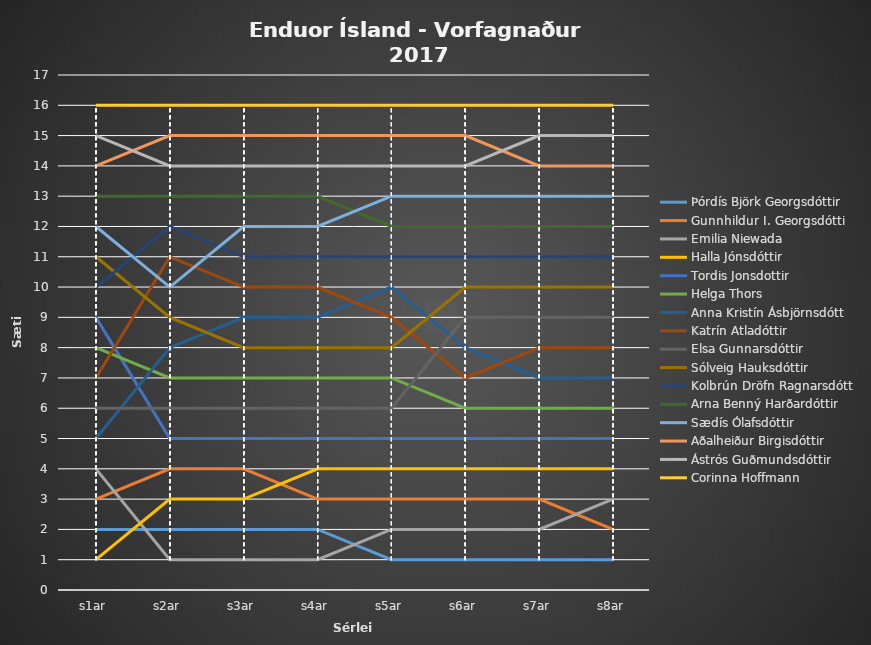
| Category | Þórdís Björk Georgsdóttir | Gunnhildur I. Georgsdótti | Emilia Niewada | Halla Jónsdóttir | Tordis Jonsdottir | Helga Thors | Anna Kristín Ásbjörnsdótt | Katrín Atladóttir | Elsa Gunnarsdóttir | Sólveig Hauksdóttir | Kolbrún Dröfn Ragnarsdótt | Arna Benný Harðardóttir | Sædís Ólafsdóttir | Aðalheiður Birgisdóttir | Ástrós Guðmundsdóttir | Corinna Hoffmann |
|---|---|---|---|---|---|---|---|---|---|---|---|---|---|---|---|---|
| s1ar | 2 | 3 | 4 | 1 | 9 | 8 | 5 | 7 | 6 | 11 | 10 | 13 | 12 | 14 | 15 | 16 |
| s2ar | 2 | 4 | 1 | 3 | 5 | 7 | 8 | 11 | 6 | 9 | 12 | 13 | 10 | 15 | 14 | 16 |
| s3ar | 2 | 4 | 1 | 3 | 5 | 7 | 9 | 10 | 6 | 8 | 11 | 13 | 12 | 15 | 14 | 16 |
| s4ar | 2 | 3 | 1 | 4 | 5 | 7 | 9 | 10 | 6 | 8 | 11 | 13 | 12 | 15 | 14 | 16 |
| s5ar | 1 | 3 | 2 | 4 | 5 | 7 | 10 | 9 | 6 | 8 | 11 | 12 | 13 | 15 | 14 | 16 |
| s6ar | 1 | 3 | 2 | 4 | 5 | 6 | 8 | 7 | 9 | 10 | 11 | 12 | 13 | 15 | 14 | 16 |
| s7ar | 1 | 3 | 2 | 4 | 5 | 6 | 7 | 8 | 9 | 10 | 11 | 12 | 13 | 14 | 15 | 16 |
| s8ar | 1 | 2 | 3 | 4 | 5 | 6 | 7 | 8 | 9 | 10 | 11 | 12 | 13 | 14 | 15 | 16 |